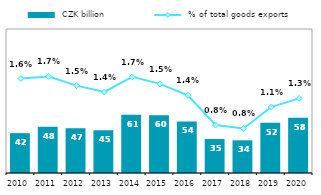
| Category |  CZK billion |
|---|---|
| 2010.0 | 41.516 |
| 2011.0 | 48.242 |
| 2012.0 | 46.622 |
| 2013.0 | 44.651 |
| 2014.0 | 60.574 |
| 2015.0 | 60.08 |
| 2016.0 | 53.661 |
| 2017.0 | 35.335 |
| 2018.0 | 34.049 |
| 2019.0 | 52.438 |
| 2020.0 | 57.544 |